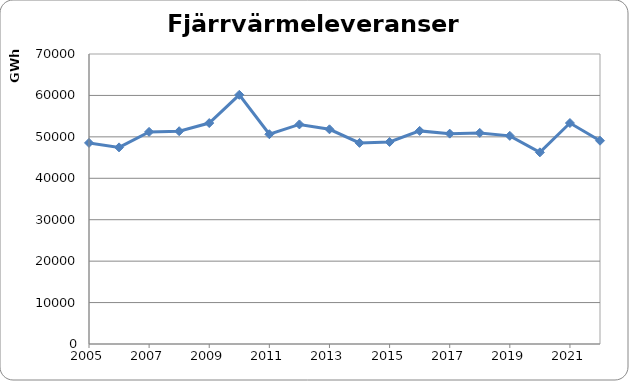
| Category | Series 0 |
|---|---|
| 2005.0 | 48543 |
| 2006.0 | 47460 |
| 2007.0 | 51202 |
| 2008.0 | 51360 |
| 2009.0 | 53332 |
| 2010.0 | 60151 |
| 2011.0 | 50631 |
| 2012.0 | 53003 |
| 2013.0 | 51824 |
| 2014.0 | 48545 |
| 2015.0 | 48761 |
| 2016.0 | 51440 |
| 2017.0 | 50775 |
| 2018.0 | 50951 |
| 2019.0 | 50244 |
| 2020.0 | 46258 |
| 2021.0 | 53334 |
| 2022.0 | 49065 |